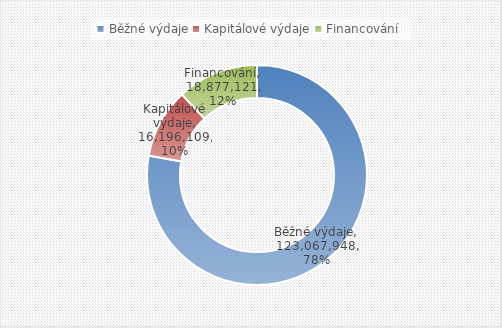
| Category | Series 0 |
|---|---|
| Běžné výdaje | 123067947.873 |
| Kapitálové výdaje | 16196108.68 |
| Financování | 18877121.447 |